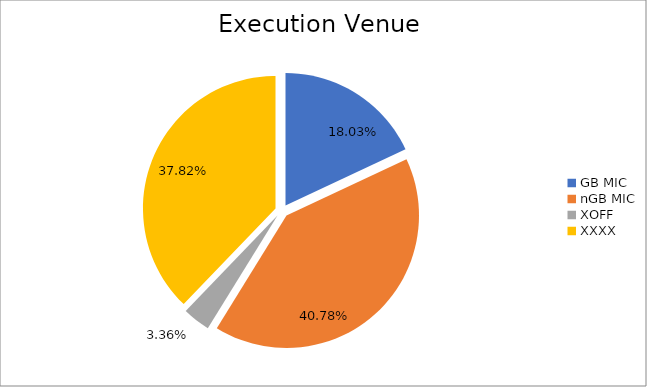
| Category | Series 0 |
|---|---|
| GB MIC | 2296882.73 |
| nGB MIC | 5195047.629 |
| XOFF | 428620.607 |
| XXXX | 4817473.978 |